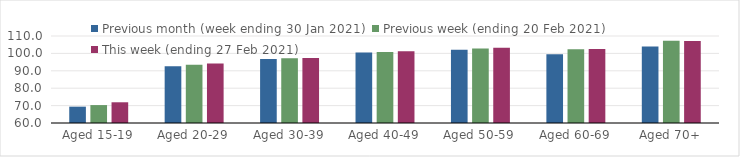
| Category | Previous month (week ending 30 Jan 2021) | Previous week (ending 20 Feb 2021) | This week (ending 27 Feb 2021) |
|---|---|---|---|
| Aged 15-19 | 69.39 | 70.3 | 71.91 |
| Aged 20-29 | 92.56 | 93.41 | 94.15 |
| Aged 30-39 | 96.85 | 97.28 | 97.42 |
| Aged 40-49 | 100.58 | 100.85 | 101.21 |
| Aged 50-59 | 102.07 | 102.78 | 103.2 |
| Aged 60-69 | 99.44 | 102.43 | 102.49 |
| Aged 70+ | 103.98 | 107.34 | 107.19 |